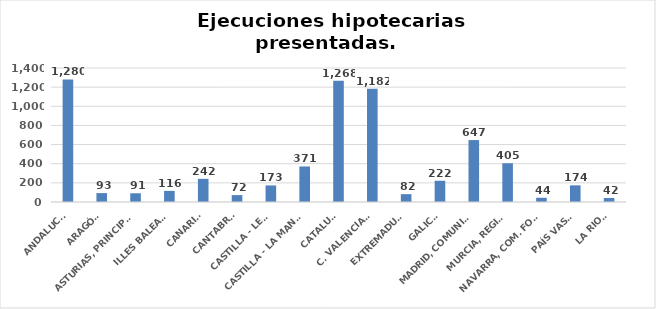
| Category | Series 0 |
|---|---|
| ANDALUCÍA | 1280 |
| ARAGÓN | 93 |
| ASTURIAS, PRINCIPADO | 91 |
| ILLES BALEARS | 116 |
| CANARIAS | 242 |
| CANTABRIA | 72 |
| CASTILLA - LEÓN | 173 |
| CASTILLA - LA MANCHA | 371 |
| CATALUÑA | 1268 |
| C. VALENCIANA | 1182 |
| EXTREMADURA | 82 |
| GALICIA | 222 |
| MADRID, COMUNIDAD | 647 |
| MURCIA, REGIÓN | 405 |
| NAVARRA, COM. FORAL | 44 |
| PAÍS VASCO | 174 |
| LA RIOJA | 42 |